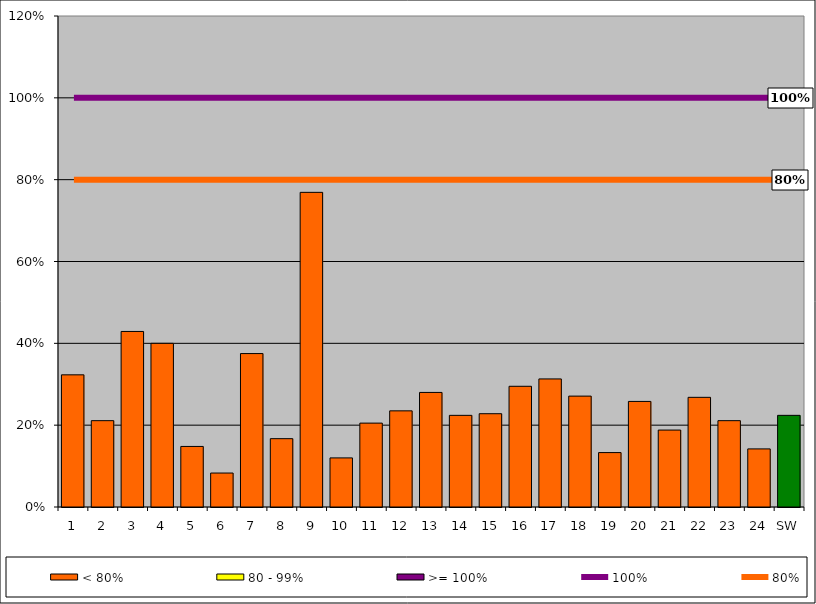
| Category | < 80% | 80 - 99% | >= 100% |
|---|---|---|---|
| 1 | 0.323 | 0 | 0 |
| 2 | 0.211 | 0 | 0 |
| 3 | 0.429 | 0 | 0 |
| 4 | 0.4 | 0 | 0 |
| 5 | 0.148 | 0 | 0 |
| 6 | 0.083 | 0 | 0 |
| 7 | 0.375 | 0 | 0 |
| 8 | 0.167 | 0 | 0 |
| 9 | 0.769 | 0 | 0 |
| 10 | 0.12 | 0 | 0 |
| 11 | 0.205 | 0 | 0 |
| 12 | 0.235 | 0 | 0 |
| 13 | 0.28 | 0 | 0 |
| 14 | 0.224 | 0 | 0 |
| 15 | 0.228 | 0 | 0 |
| 16 | 0.295 | 0 | 0 |
| 17 | 0.313 | 0 | 0 |
| 18 | 0.271 | 0 | 0 |
| 19 | 0.133 | 0 | 0 |
| 20 | 0.258 | 0 | 0 |
| 21 | 0.188 | 0 | 0 |
| 22 | 0.268 | 0 | 0 |
| 23 | 0.211 | 0 | 0 |
| 24 | 0.142 | 0 | 0 |
| SW | 0.224 | 0 | 0 |